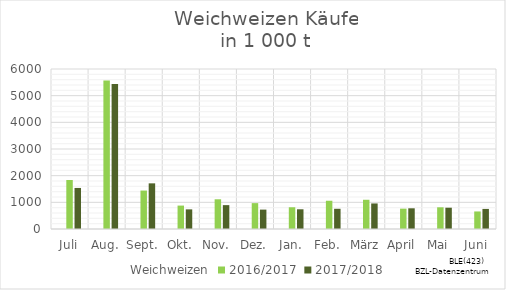
| Category | Weichweizen | 2016/2017 | 2017/2018 |
|---|---|---|---|
| Juli |  | 1837.913 | 1539.187 |
| Aug. |  | 5568.902 | 5434.455 |
| Sept. |  | 1441.561 | 1712.099 |
| Okt. |  | 878.163 | 736.444 |
| Nov. |  | 1114.429 | 895.036 |
| Dez. |  | 970.068 | 727.242 |
| Jan. |  | 815.584 | 739.536 |
| Feb. |  | 1059.624 | 758.154 |
| März |  | 1096.312 | 958.328 |
| April |  | 762.968 | 776.191 |
| Mai |  | 814.241 | 798.451 |
| Juni |  | 658.137 | 753.011 |